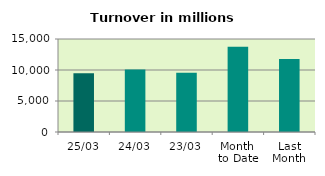
| Category | Series 0 |
|---|---|
| 25/03 | 9465.756 |
| 24/03 | 10089.248 |
| 23/03 | 9570.459 |
| Month 
to Date | 13763.085 |
| Last
Month | 11787.675 |